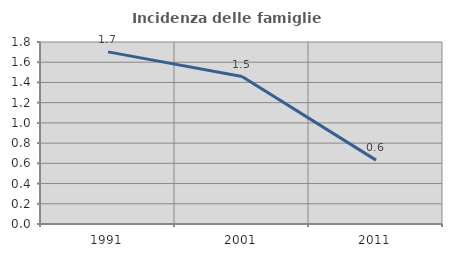
| Category | Incidenza delle famiglie numerose |
|---|---|
| 1991.0 | 1.702 |
| 2001.0 | 1.458 |
| 2011.0 | 0.632 |